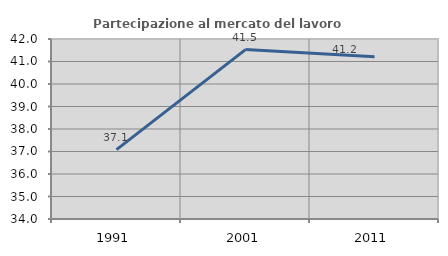
| Category | Partecipazione al mercato del lavoro  femminile |
|---|---|
| 1991.0 | 37.085 |
| 2001.0 | 41.53 |
| 2011.0 | 41.209 |